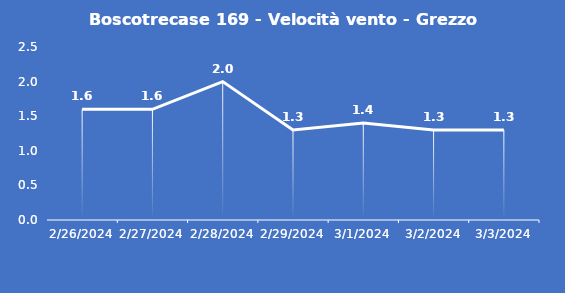
| Category | Boscotrecase 169 - Velocità vento - Grezzo (m/s) |
|---|---|
| 2/26/24 | 1.6 |
| 2/27/24 | 1.6 |
| 2/28/24 | 2 |
| 2/29/24 | 1.3 |
| 3/1/24 | 1.4 |
| 3/2/24 | 1.3 |
| 3/3/24 | 1.3 |